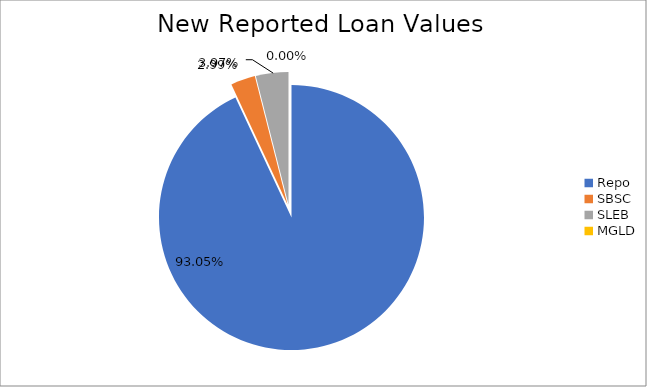
| Category | Series 0 |
|---|---|
| Repo | 9171646.715 |
| SBSC | 294258.11 |
| SLEB | 391214.363 |
| MGLD | 81.178 |